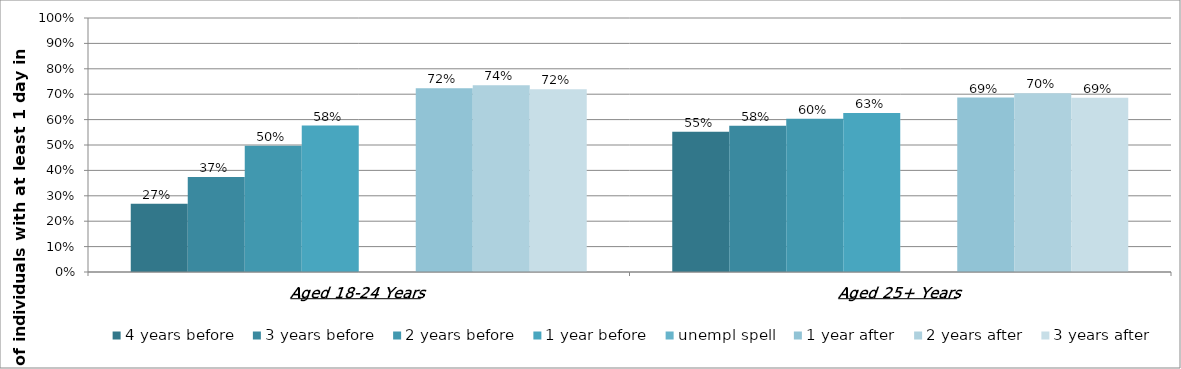
| Category | 4 years before | 3 years before | 2 years before | 1 year before | unempl spell | 1 year after | 2 years after | 3 years after |
|---|---|---|---|---|---|---|---|---|
| Aged 18-24 Years | 0.269 | 0.374 | 0.497 | 0.576 | 0 | 0.724 | 0.735 | 0.72 |
| Aged 25+ Years | 0.552 | 0.576 | 0.604 | 0.626 | 0 | 0.687 | 0.703 | 0.686 |